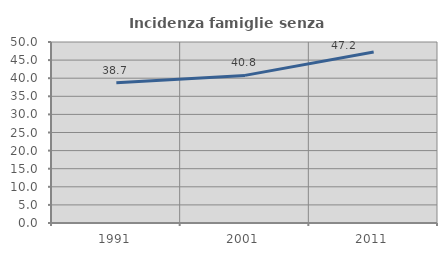
| Category | Incidenza famiglie senza nuclei |
|---|---|
| 1991.0 | 38.71 |
| 2001.0 | 40.777 |
| 2011.0 | 47.222 |